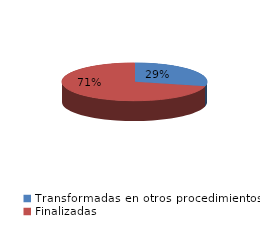
| Category | Series 0 |
|---|---|
| Transformadas en otros procedimientos | 1213 |
| Finalizadas | 3010 |